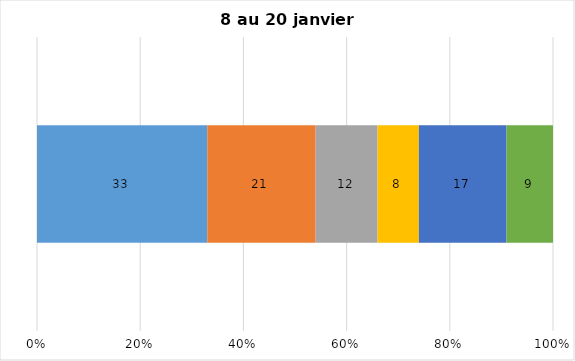
| Category | Plusieurs fois par jour | Une fois par jour | Quelques fois par semaine   | Une fois par semaine ou moins   |  Jamais   |  Je n’utilise pas les médias sociaux |
|---|---|---|---|---|---|---|
| 0 | 33 | 21 | 12 | 8 | 17 | 9 |